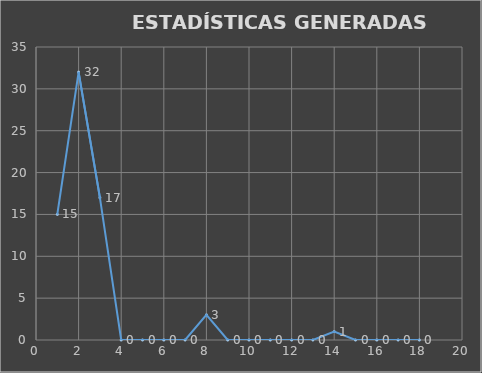
| Category |                   ESTADÍSTICAS GENERADAS     PERIODO OCTUBRE 19 CANTIDAD |
|---|---|
| 0 | 15 |
| 1 | 32 |
| 2 | 17 |
| 3 | 0 |
| 4 | 0 |
| 5 | 0 |
| 6 | 0 |
| 7 | 3 |
| 8 | 0 |
| 9 | 0 |
| 10 | 0 |
| 11 | 0 |
| 12 | 0 |
| 13 | 1 |
| 14 | 0 |
| 15 | 0 |
| 16 | 0 |
| 17 | 0 |